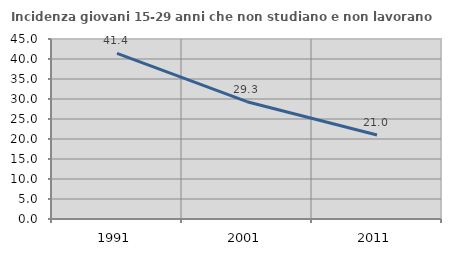
| Category | Incidenza giovani 15-29 anni che non studiano e non lavorano  |
|---|---|
| 1991.0 | 41.414 |
| 2001.0 | 29.326 |
| 2011.0 | 20.999 |